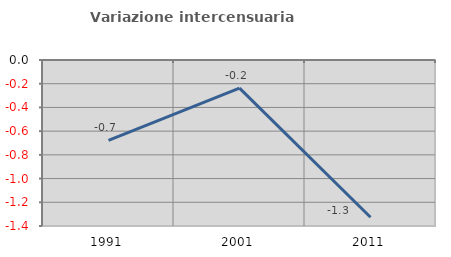
| Category | Variazione intercensuaria annua |
|---|---|
| 1991.0 | -0.678 |
| 2001.0 | -0.237 |
| 2011.0 | -1.326 |